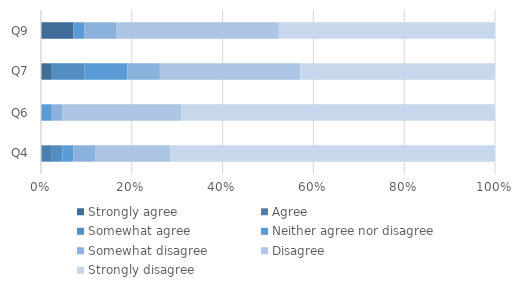
| Category | Strongly agree | Agree | Somewhat agree | Neither agree nor disagree | Somewhat disagree | Disagree | Strongly disagree |
|---|---|---|---|---|---|---|---|
| Q4 | 0 | 0.024 | 0.024 | 0.024 | 0.048 | 0.167 | 0.714 |
| Q6 | 0 | 0 | 0 | 0.024 | 0.024 | 0.262 | 0.69 |
| Q7 | 0.024 | 0 | 0.071 | 0.095 | 0.071 | 0.31 | 0.429 |
| Q9 | 0.071 | 0 | 0 | 0.024 | 0.071 | 0.357 | 0.476 |